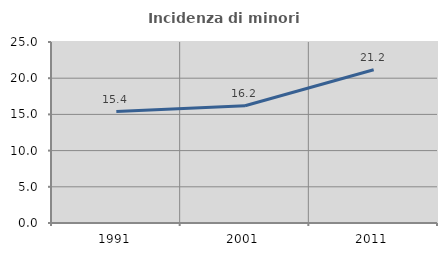
| Category | Incidenza di minori stranieri |
|---|---|
| 1991.0 | 15.385 |
| 2001.0 | 16.197 |
| 2011.0 | 21.16 |